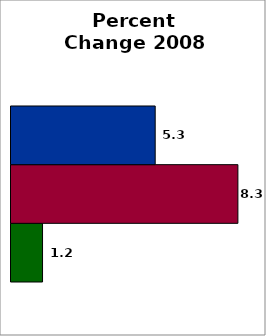
| Category | School | SREB states (average) | 50 states and D.C. (average) |
|---|---|---|---|
| 0 | 1.154 | 8.301 | 5.276 |